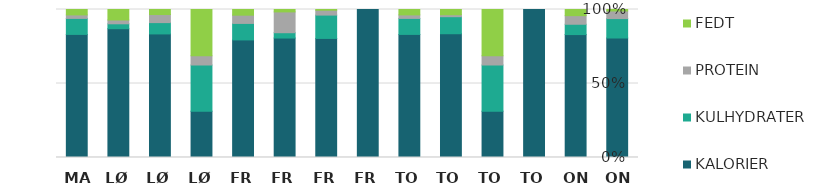
| Category | KALORIER | KULHYDRATER | PROTEIN | FEDT |
|---|---|---|---|---|
| ON | 283 | 46 | 18 | 3.5 |
| ON | 500 | 42 | 35 | 25 |
| TO | 1 | 0 | 0 | 0 |
| TO | 10 | 10 | 2 | 10 |
| TO | 189 | 26 | 3 | 8 |
| TO | 477 | 62 | 13.5 | 21 |
| FR | 1 | 0 | 0 | 0 |
| FR | 245 | 48 | 10 | 1.5 |
| FR | 247 | 11 | 43 | 5 |
| FR | 456 | 64 | 32 | 22 |
| LØ | 10 | 10 | 2 | 10 |
| LØ | 135 | 12.36 | 8.81 | 5.51 |
| LØ | 184 | 7 | 5.43 | 15 |
| MA | 477 | 62 | 13.5 | 21 |